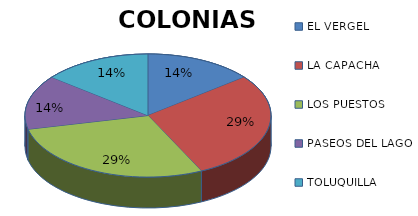
| Category | COLONIA |
|---|---|
| EL VERGEL | 1 |
| LA CAPACHA | 2 |
| LOS PUESTOS | 2 |
| PASEOS DEL LAGO | 1 |
| TOLUQUILLA | 1 |